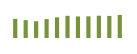
| Category | Saldo [ (1)-(2) ] |
|---|---|
| 0 | 532729.955 |
| 1 | 495602.949 |
| 2 | 464912.543 |
| 3 | 524886.84 |
| 4 | 575003.691 |
| 5 | 617133.535 |
| 6 | 598394.561 |
| 7 | 601130.812 |
| 8 | 618778.996 |
| 9 | 613706.598 |
| 10 | 641913.051 |